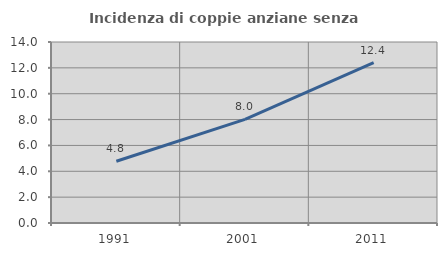
| Category | Incidenza di coppie anziane senza figli  |
|---|---|
| 1991.0 | 4.773 |
| 2001.0 | 8.014 |
| 2011.0 | 12.399 |